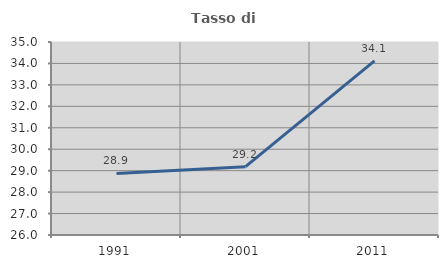
| Category | Tasso di occupazione   |
|---|---|
| 1991.0 | 28.872 |
| 2001.0 | 29.185 |
| 2011.0 | 34.123 |